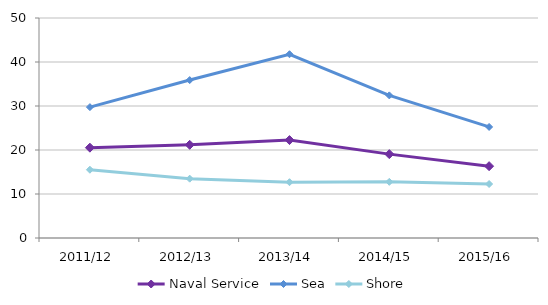
| Category | Naval Service | Sea | Shore |
|---|---|---|---|
| 2011/12 | 20.531 | 29.743 | 15.518 |
| 2012/13 | 21.178 | 35.893 | 13.481 |
| 2013/14 | 22.256 | 41.763 | 12.68 |
| 2014/15 | 19.061 | 32.414 | 12.766 |
| 2015/16 | 16.326 | 25.24 | 12.27 |